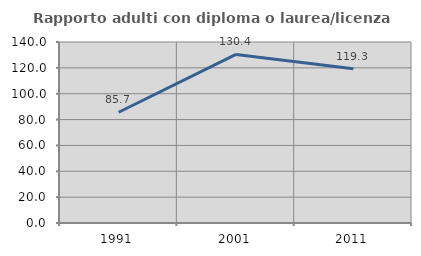
| Category | Rapporto adulti con diploma o laurea/licenza media  |
|---|---|
| 1991.0 | 85.663 |
| 2001.0 | 130.408 |
| 2011.0 | 119.259 |